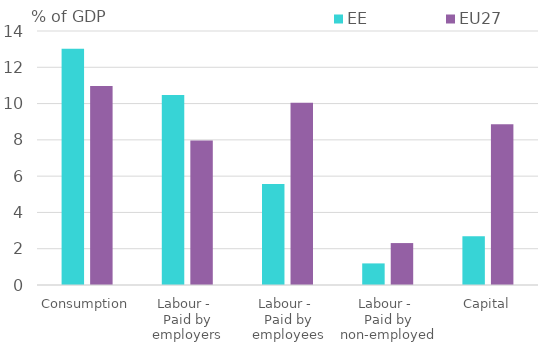
| Category | EE | EU27 |
|---|---|---|
| Consumption | 13.027 | 10.967 |
| Labour - 
Paid by employers | 10.472 | 7.966 |
| Labour - 
Paid by employees | 5.563 | 10.052 |
| Labour - 
Paid by non-employed | 1.19 | 2.311 |
| Capital | 2.687 | 8.858 |